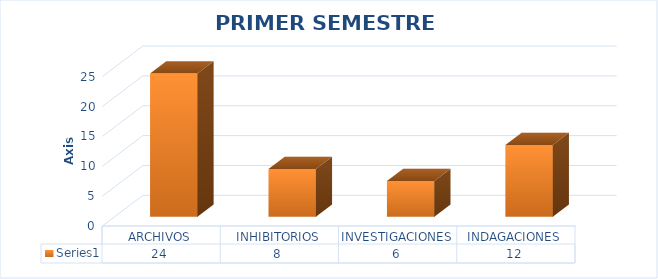
| Category | Series 0 |
|---|---|
| ARCHIVOS | 24 |
| INHIBITORIOS | 8 |
| INVESTIGACIONES | 6 |
| INDAGACIONES | 12 |